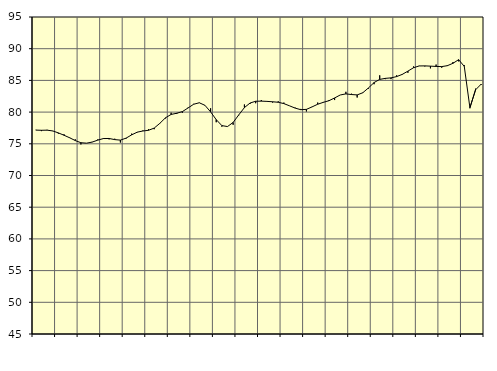
| Category | Piggar | Samtliga sysselsatta (inkl. sysselsatta utomlands) |
|---|---|---|
| nan | 77.2 | 77.16 |
| 1.0 | 77 | 77.13 |
| 1.0 | 77.2 | 77.15 |
| 1.0 | 77 | 77.03 |
| nan | 76.6 | 76.72 |
| 2.0 | 76.5 | 76.35 |
| 2.0 | 76 | 75.95 |
| 2.0 | 75.7 | 75.51 |
| nan | 74.9 | 75.17 |
| 3.0 | 75.1 | 75.1 |
| 3.0 | 75.3 | 75.27 |
| 3.0 | 75.7 | 75.58 |
| nan | 75.9 | 75.83 |
| 4.0 | 75.7 | 75.84 |
| 4.0 | 75.8 | 75.66 |
| 4.0 | 75.2 | 75.58 |
| nan | 75.8 | 75.89 |
| 5.0 | 76.6 | 76.41 |
| 5.0 | 76.8 | 76.84 |
| 5.0 | 77.1 | 77.02 |
| nan | 77.3 | 77.13 |
| 6.0 | 77.3 | 77.48 |
| 6.0 | 78.2 | 78.23 |
| 6.0 | 79 | 79.1 |
| nan | 79.9 | 79.63 |
| 7.0 | 79.7 | 79.82 |
| 7.0 | 79.9 | 80.08 |
| 7.0 | 80.7 | 80.65 |
| nan | 81.3 | 81.24 |
| 8.0 | 81.5 | 81.47 |
| 8.0 | 81.1 | 81.07 |
| 8.0 | 80.6 | 80.04 |
| nan | 78.4 | 78.81 |
| 9.0 | 77.7 | 77.87 |
| 9.0 | 77.7 | 77.72 |
| 9.0 | 78 | 78.37 |
| nan | 79.5 | 79.56 |
| 10.0 | 81.2 | 80.71 |
| 10.0 | 81.3 | 81.43 |
| 10.0 | 81.4 | 81.71 |
| nan | 81.9 | 81.73 |
| 11.0 | 81.7 | 81.69 |
| 11.0 | 81.5 | 81.63 |
| 11.0 | 81.7 | 81.55 |
| nan | 81.5 | 81.34 |
| 12.0 | 81 | 80.99 |
| 12.0 | 80.7 | 80.63 |
| 12.0 | 80.5 | 80.38 |
| nan | 80.1 | 80.43 |
| 13.0 | 80.8 | 80.82 |
| 13.0 | 81.5 | 81.24 |
| 13.0 | 81.6 | 81.54 |
| nan | 81.9 | 81.8 |
| 14.0 | 81.9 | 82.23 |
| 14.0 | 82.7 | 82.7 |
| 14.0 | 83.2 | 82.87 |
| nan | 82.9 | 82.77 |
| 15.0 | 82.3 | 82.71 |
| 15.0 | 83.1 | 83.05 |
| 15.0 | 83.7 | 83.81 |
| nan | 84.4 | 84.66 |
| 16.0 | 85.8 | 85.16 |
| 16.0 | 85.2 | 85.32 |
| 16.0 | 85.2 | 85.4 |
| nan | 85.8 | 85.6 |
| 17.0 | 85.9 | 85.95 |
| 17.0 | 86.2 | 86.46 |
| 17.0 | 87.2 | 87 |
| nan | 87.3 | 87.28 |
| 18.0 | 87.2 | 87.29 |
| 18.0 | 86.9 | 87.25 |
| 18.0 | 87.5 | 87.2 |
| nan | 87 | 87.18 |
| 19.0 | 87.4 | 87.32 |
| 19.0 | 87.9 | 87.7 |
| 19.0 | 88 | 88.27 |
| nan | 87.4 | 87.21 |
| 20.0 | 80.6 | 80.69 |
| 20.0 | 83.7 | 83.51 |
| 20.0 | 84.3 | 84.41 |